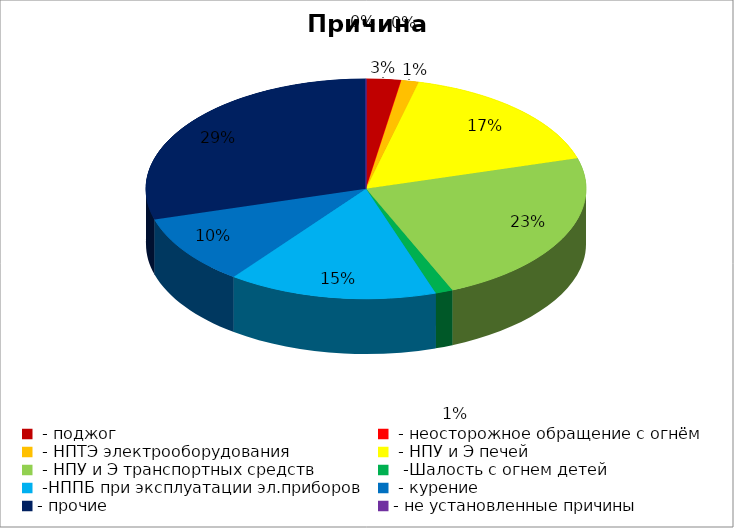
| Category | Причина пожара |
|---|---|
|  - поджог | 2 |
|  - неосторожное обращение с огнём | 0 |
|  - НПТЭ электрооборудования | 1 |
|  - НПУ и Э печей | 13 |
|  - НПУ и Э транспортных средств | 18 |
|   -Шалость с огнем детей | 1 |
|  -НППБ при эксплуатации эл.приборов | 12 |
|  - курение | 8 |
| - прочие | 23 |
| - не установленные причины | 0 |